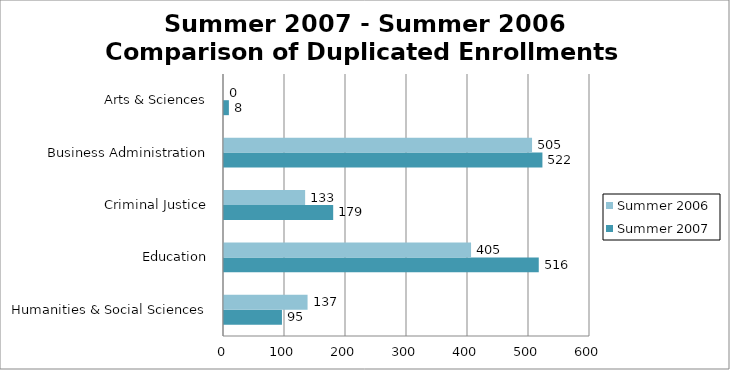
| Category | Summer 2007 | Summer 2006 |
|---|---|---|
| Humanities & Social Sciences | 95 | 137 |
| Education | 516 | 405 |
| Criminal Justice | 179 | 133 |
| Business Administration | 522 | 505 |
| Arts & Sciences | 8 | 0 |